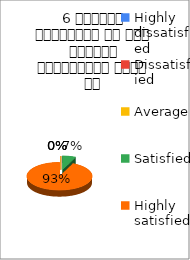
| Category | 6 शिक्षक समयनिष्ट है एवं नियमित व्याख्यान देते है  |
|---|---|
| Highly dissatisfied | 0 |
| Dissatisfied | 0 |
| Average | 0 |
| Satisfied | 1 |
| Highly satisfied | 14 |